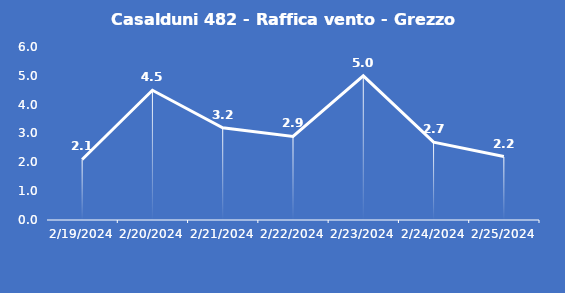
| Category | Casalduni 482 - Raffica vento - Grezzo (m/s) |
|---|---|
| 2/19/24 | 2.1 |
| 2/20/24 | 4.5 |
| 2/21/24 | 3.2 |
| 2/22/24 | 2.9 |
| 2/23/24 | 5 |
| 2/24/24 | 2.7 |
| 2/25/24 | 2.2 |